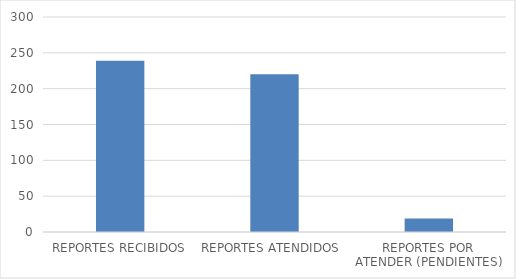
| Category | Series 0 |
|---|---|
| REPORTES RECIBIDOS | 239 |
| REPORTES ATENDIDOS  | 220 |
| REPORTES POR ATENDER (PENDIENTES) | 19 |